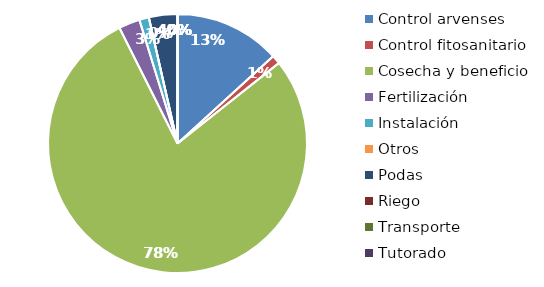
| Category | Valor |
|---|---|
| Control arvenses | 11250000 |
| Control fitosanitario | 930000 |
| Cosecha y beneficio | 66577500 |
| Fertilización | 2250000 |
| Instalación | 1020000 |
| Otros | 0 |
| Podas | 3030000 |
| Riego | 0 |
| Transporte | 0 |
| Tutorado | 0 |